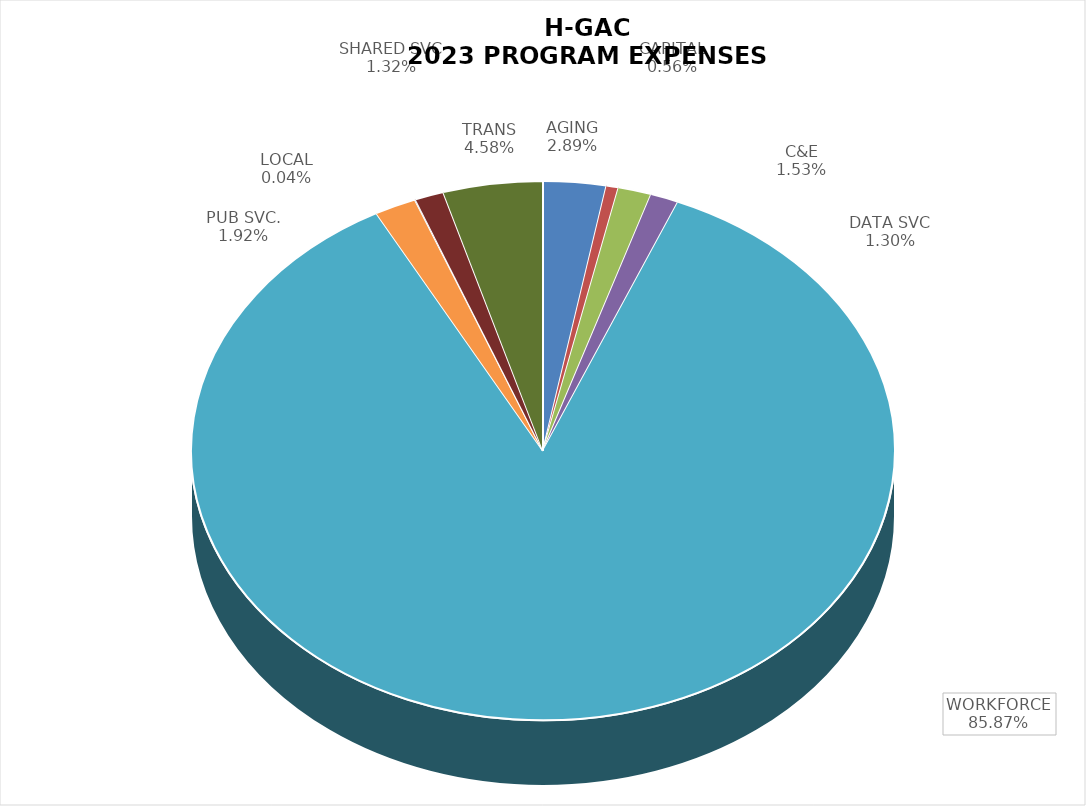
| Category | Series 0 |
|---|---|
| AGING | 0.029 |
| CAPITAL | 0.006 |
| C&E | 0.015 |
| DATA SVC | 0.013 |
| WORKFORCE | 0.859 |
| PUB SVC. | 0.019 |
| LOCAL | 0 |
| SHARED SVC | 0.013 |
| TRANS | 0.046 |